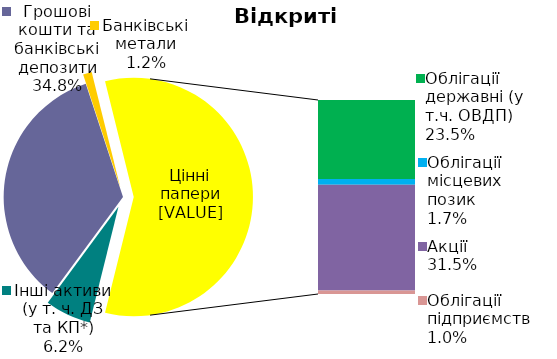
| Category | Series 0 |
|---|---|
| Інші активи (у т. ч. ДЗ та КП*) | 0.062 |
| Грошові кошти та банківські депозити | 0.348 |
| Банківські метали | 0.012 |
| Облігації державні (у т.ч. ОВДП) | 0.235 |
| Облігації місцевих позик | 0.017 |
| Акцiї | 0.315 |
| Облігації підприємств | 0.01 |